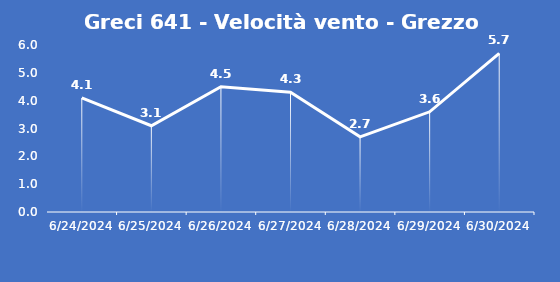
| Category | Greci 641 - Velocità vento - Grezzo (m/s) |
|---|---|
| 6/24/24 | 4.1 |
| 6/25/24 | 3.1 |
| 6/26/24 | 4.5 |
| 6/27/24 | 4.3 |
| 6/28/24 | 2.7 |
| 6/29/24 | 3.6 |
| 6/30/24 | 5.7 |